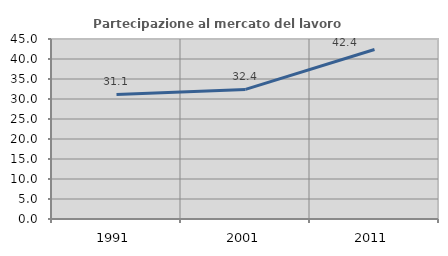
| Category | Partecipazione al mercato del lavoro  femminile |
|---|---|
| 1991.0 | 31.13 |
| 2001.0 | 32.392 |
| 2011.0 | 42.363 |